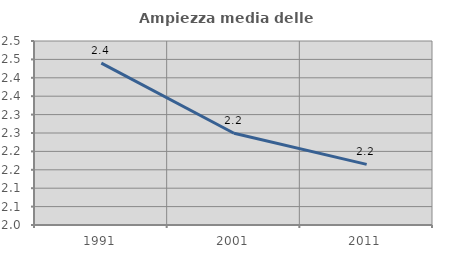
| Category | Ampiezza media delle famiglie |
|---|---|
| 1991.0 | 2.44 |
| 2001.0 | 2.249 |
| 2011.0 | 2.165 |